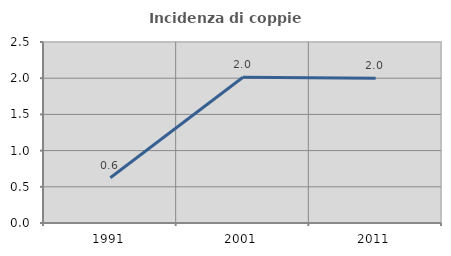
| Category | Incidenza di coppie miste |
|---|---|
| 1991.0 | 0.625 |
| 2001.0 | 2.013 |
| 2011.0 | 1.998 |